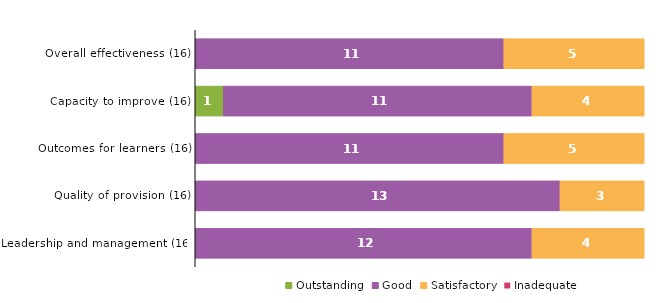
| Category | Outstanding | Good | Satisfactory | Inadequate |
|---|---|---|---|---|
| Overall effectiveness (16) | 0 | 11 | 5 | 0 |
| Capacity to improve (16) | 1 | 11 | 4 | 0 |
| Outcomes for learners (16) | 0 | 11 | 5 | 0 |
| Quality of provision (16) | 0 | 13 | 3 | 0 |
| Leadership and management (16) | 0 | 12 | 4 | 0 |